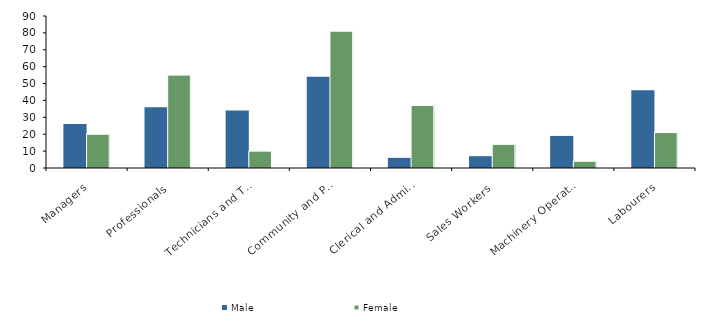
| Category | Male | Female |
|---|---|---|
| Managers | 26 | 20 |
| Professionals | 36 | 55 |
| Technicians and Trades Workers | 34 | 10 |
| Community and Personal Service Workers | 54 | 81 |
| Clerical and Administrative Workers | 6 | 37 |
| Sales Workers | 7 | 14 |
| Machinery Operators and Drivers | 19 | 4 |
| Labourers | 46 | 21 |